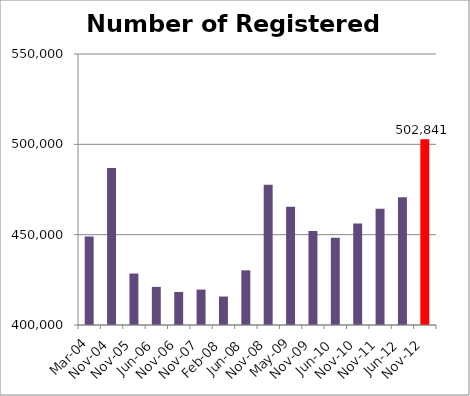
| Category | Number of Registered Voters |
|---|---|
| Mar-04 | 448948 |
| Nov-04 | 486937 |
| Nov-05 | 428481 |
| Jun-06 | 421094 |
| Nov-06 | 418285 |
| Nov-07 | 419598 |
| Feb-08 | 415761 |
| Jun-08 | 430259 |
| Nov-08 | 477651 |
| May-09 | 465428 |
| Nov-09 | 451988 |
| Jun-10 | 448346 |
| Nov-10 | 456179 |
| Nov-11 | 464380 |
| Jun-12 | 470668 |
| Nov-12 | 502841 |